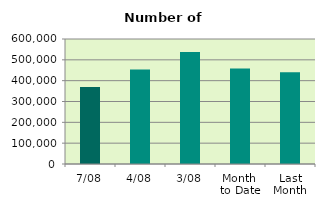
| Category | Series 0 |
|---|---|
| 7/08 | 369220 |
| 4/08 | 453688 |
| 3/08 | 538106 |
| Month 
to Date | 458411.6 |
| Last
Month | 440756.667 |